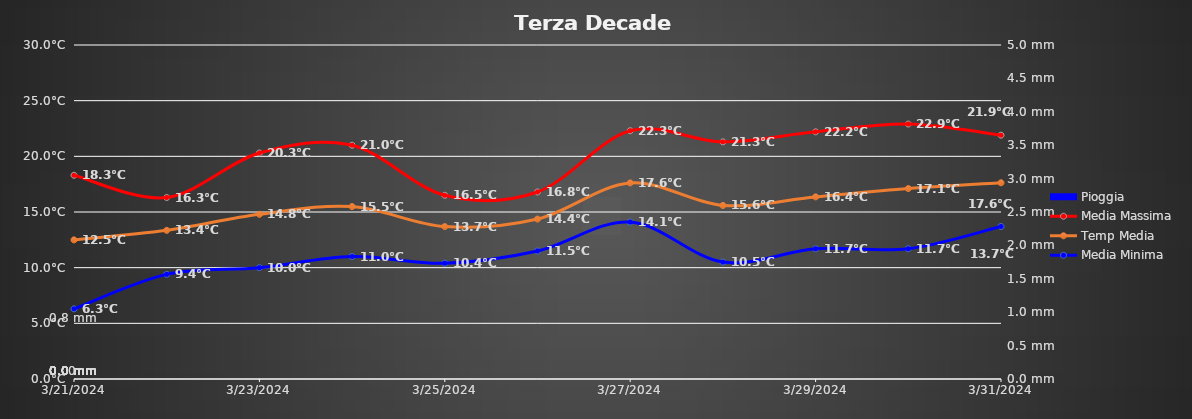
| Category | Pioggia |
|---|---|
| 3/21/24 | 0 |
| 3/22/24 | 0 |
| 3/23/24 | 0 |
| 3/24/24 | 0 |
| 3/25/24 | 0 |
| 3/26/24 | 0.8 |
| 3/27/24 | 0 |
| 3/28/24 | 0 |
| 3/29/24 | 0 |